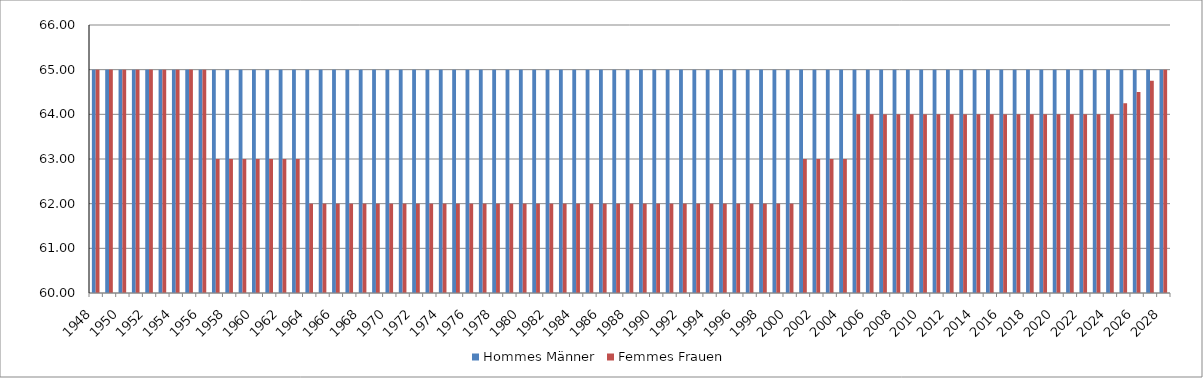
| Category | Hommes | Femmes |
|---|---|---|
| 1948.0 | 65 | 65 |
| 1949.0 | 65 | 65 |
| 1950.0 | 65 | 65 |
| 1951.0 | 65 | 65 |
| 1952.0 | 65 | 65 |
| 1953.0 | 65 | 65 |
| 1954.0 | 65 | 65 |
| 1955.0 | 65 | 65 |
| 1956.0 | 65 | 65 |
| 1957.0 | 65 | 63 |
| 1958.0 | 65 | 63 |
| 1959.0 | 65 | 63 |
| 1960.0 | 65 | 63 |
| 1961.0 | 65 | 63 |
| 1962.0 | 65 | 63 |
| 1963.0 | 65 | 63 |
| 1964.0 | 65 | 62 |
| 1965.0 | 65 | 62 |
| 1966.0 | 65 | 62 |
| 1967.0 | 65 | 62 |
| 1968.0 | 65 | 62 |
| 1969.0 | 65 | 62 |
| 1970.0 | 65 | 62 |
| 1971.0 | 65 | 62 |
| 1972.0 | 65 | 62 |
| 1973.0 | 65 | 62 |
| 1974.0 | 65 | 62 |
| 1975.0 | 65 | 62 |
| 1976.0 | 65 | 62 |
| 1977.0 | 65 | 62 |
| 1978.0 | 65 | 62 |
| 1979.0 | 65 | 62 |
| 1980.0 | 65 | 62 |
| 1981.0 | 65 | 62 |
| 1982.0 | 65 | 62 |
| 1983.0 | 65 | 62 |
| 1984.0 | 65 | 62 |
| 1985.0 | 65 | 62 |
| 1986.0 | 65 | 62 |
| 1987.0 | 65 | 62 |
| 1988.0 | 65 | 62 |
| 1989.0 | 65 | 62 |
| 1990.0 | 65 | 62 |
| 1991.0 | 65 | 62 |
| 1992.0 | 65 | 62 |
| 1993.0 | 65 | 62 |
| 1994.0 | 65 | 62 |
| 1995.0 | 65 | 62 |
| 1996.0 | 65 | 62 |
| 1997.0 | 65 | 62 |
| 1998.0 | 65 | 62 |
| 1999.0 | 65 | 62 |
| 2000.0 | 65 | 62 |
| 2001.0 | 65 | 63 |
| 2002.0 | 65 | 63 |
| 2003.0 | 65 | 63 |
| 2004.0 | 65 | 63 |
| 2005.0 | 65 | 64 |
| 2006.0 | 65 | 64 |
| 2007.0 | 65 | 64 |
| 2008.0 | 65 | 64 |
| 2009.0 | 65 | 64 |
| 2010.0 | 65 | 64 |
| 2011.0 | 65 | 64 |
| 2012.0 | 65 | 64 |
| 2013.0 | 65 | 64 |
| 2014.0 | 65 | 64 |
| 2015.0 | 65 | 64 |
| 2016.0 | 65 | 64 |
| 2017.0 | 65 | 64 |
| 2018.0 | 65 | 64 |
| 2019.0 | 65 | 64 |
| 2020.0 | 65 | 64 |
| 2021.0 | 65 | 64 |
| 2022.0 | 65 | 64 |
| 2023.0 | 65 | 64 |
| 2024.0 | 65 | 64 |
| 2025.0 | 65 | 64.25 |
| 2026.0 | 65 | 64.5 |
| 2027.0 | 65 | 64.75 |
| 2028.0 | 65 | 65 |